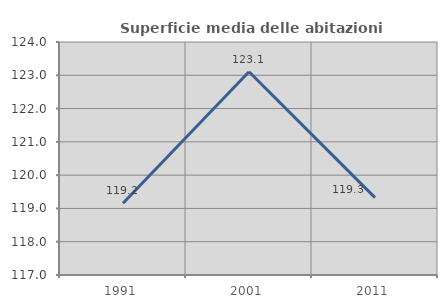
| Category | Superficie media delle abitazioni occupate |
|---|---|
| 1991.0 | 119.153 |
| 2001.0 | 123.108 |
| 2011.0 | 119.323 |